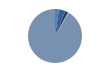
| Category | Series 0 |
|---|---|
| ARRASTRE | 22 |
| CERCO | 37 |
| PALANGRE | 18 |
| REDES DE ENMALLE | 2 |
| ARTES FIJAS | 1 |
| ARTES MENORES | 864 |